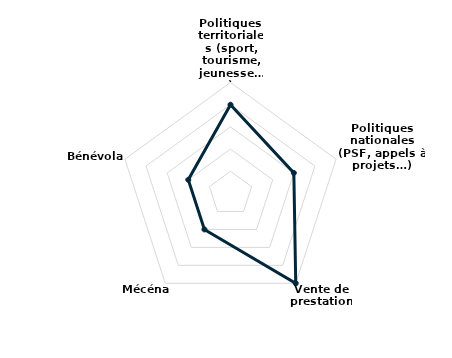
| Category | Series 0 |
|---|---|
| Politiques  territoriales (sport, tourisme, jeunesse…) | 4 |
| Politiques nationales (PSF, appels à projets…) | 3 |
| Vente de prestations | 5 |
| Mécénat | 2 |
| Bénévolat | 2 |